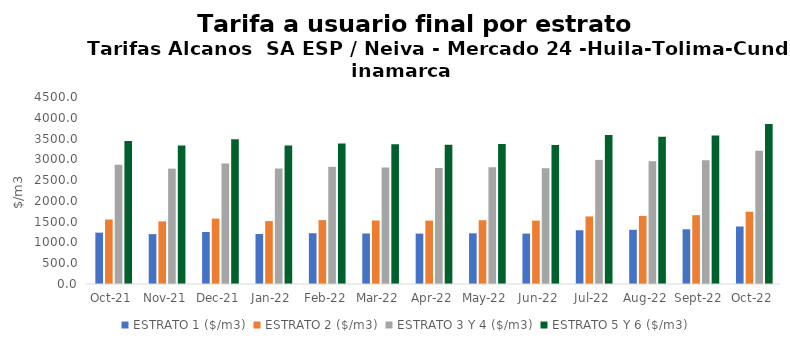
| Category | ESTRATO 1 ($/m3) | ESTRATO 2 ($/m3) | ESTRATO 3 Y 4 ($/m3) | ESTRATO 5 Y 6 ($/m3) |
|---|---|---|---|---|
| 2021-10-01 | 1235.94 | 1551.81 | 2868 | 3441.6 |
| 2021-11-01 | 1200.29 | 1507.63 | 2775.81 | 3330.972 |
| 2021-12-01 | 1252.11 | 1574.14 | 2902.39 | 3482.868 |
| 2022-01-01 | 1204.22 | 1513.73 | 2778.76 | 3334.512 |
| 2022-02-01 | 1221.94 | 1536.68 | 2818.77 | 3382.524 |
| 2022-03-01 | 1215.9 | 1527.93 | 2801.57 | 3361.884 |
| 2022-04-01 | 1212.81 | 1525 | 2791.83 | 3350.196 |
| 2022-05-01 | 1219.94 | 1534.44 | 2808.77 | 3370.524 |
| 2022-06-01 | 1212.49 | 1524.79 | 2787.21 | 3344.652 |
| 2022-07-01 | 1293.01 | 1625.8 | 2986.65 | 3583.98 |
| 2022-08-01 | 1303.53 | 1638.87 | 2951.9 | 3542.28 |
| 2022-09-01 | 1316.79 | 1655.76 | 2979.32 | 3575.184 |
| 2022-10-01 | 1383.39 | 1739.03 | 3208.12 | 3849.744 |